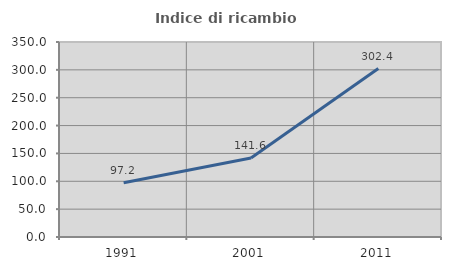
| Category | Indice di ricambio occupazionale  |
|---|---|
| 1991.0 | 97.214 |
| 2001.0 | 141.637 |
| 2011.0 | 302.404 |